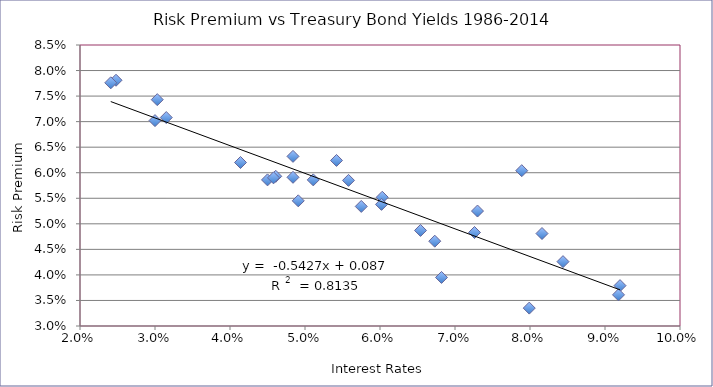
| Category | Series 0 |
|---|---|
| 0.0789 | 0.06 |
| 0.092 | 0.038 |
| 0.0918 | 0.036 |
| 0.0816 | 0.048 |
| 0.0844 | 0.043 |
| 0.073 | 0.053 |
| 0.0726 | 0.048 |
| 0.0654 | 0.049 |
| 0.0799 | 0.034 |
| 0.0603 | 0.055 |
| 0.0673 | 0.047 |
| 0.0602 | 0.054 |
| 0.0542 | 0.062 |
| 0.0682 | 0.04 |
| 0.0558 | 0.058 |
| 0.0575 | 0.053 |
| 0.0484 | 0.063 |
| 0.0511 | 0.059 |
| 0.0484 | 0.059 |
| 0.0461 | 0.059 |
| 0.0491 | 0.054 |
| 0.045 | 0.059 |
| 0.0303 | 0.074 |
| 0.0458 | 0.059 |
| 0.0414 | 0.062 |
| 0.0248 | 0.078 |
| 0.0241 | 0.078 |
| 0.03 | 0.07 |
| 0.0315 | 0.071 |